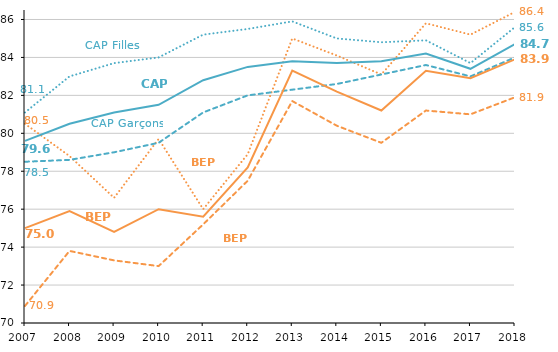
| Category | BEP Filles | BEP Garçons | CAP Garçons | CAP Filles | BEP | CAP |
|---|---|---|---|---|---|---|
| 2007.0 | 80.5 | 70.9 | 78.5 | 81.1 | 75 | 79.6 |
| 2008.0 | 78.8 | 73.8 | 78.6 | 83 | 75.9 | 80.5 |
| 2009.0 | 76.6 | 73.3 | 79 | 83.7 | 74.8 | 81.1 |
| 2010.0 | 79.7 | 73 | 79.5 | 84 | 76 | 81.5 |
| 2011.0 | 76 | 75.2 | 81.1 | 85.2 | 75.6 | 82.8 |
| 2012.0 | 78.9 | 77.5 | 82 | 85.5 | 78.2 | 83.5 |
| 2013.0 | 85 | 81.7 | 82.3 | 85.9 | 83.3 | 83.8 |
| 2014.0 | 84.1 | 80.4 | 82.6 | 85 | 82.2 | 83.7 |
| 2015.0 | 83.1 | 79.5 | 83.1 | 84.8 | 81.2 | 83.8 |
| 2016.0 | 85.8 | 81.2 | 83.6 | 84.9 | 83.3 | 84.2 |
| 2017.0 | 85.2 | 81 | 83 | 83.7 | 82.9 | 83.4 |
| 2018.0 | 86.4 | 81.9 | 84 | 85.6 | 83.9 | 84.7 |